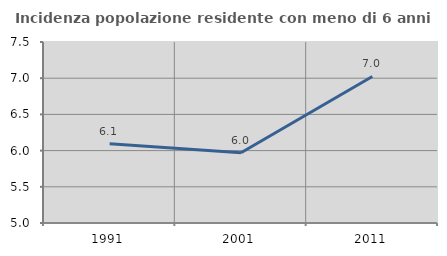
| Category | Incidenza popolazione residente con meno di 6 anni |
|---|---|
| 1991.0 | 6.096 |
| 2001.0 | 5.971 |
| 2011.0 | 7.024 |